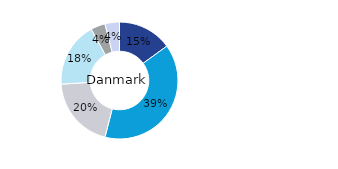
| Category | Danmark |
|---|---|
| Kontor | 0.15 |
| Bostäder | 0.39 |
| Handel | 0.2 |
| Logistik* | 0.18 |
| Samhällsfastigheter | 0.04 |
| Övrigt | 0.04 |